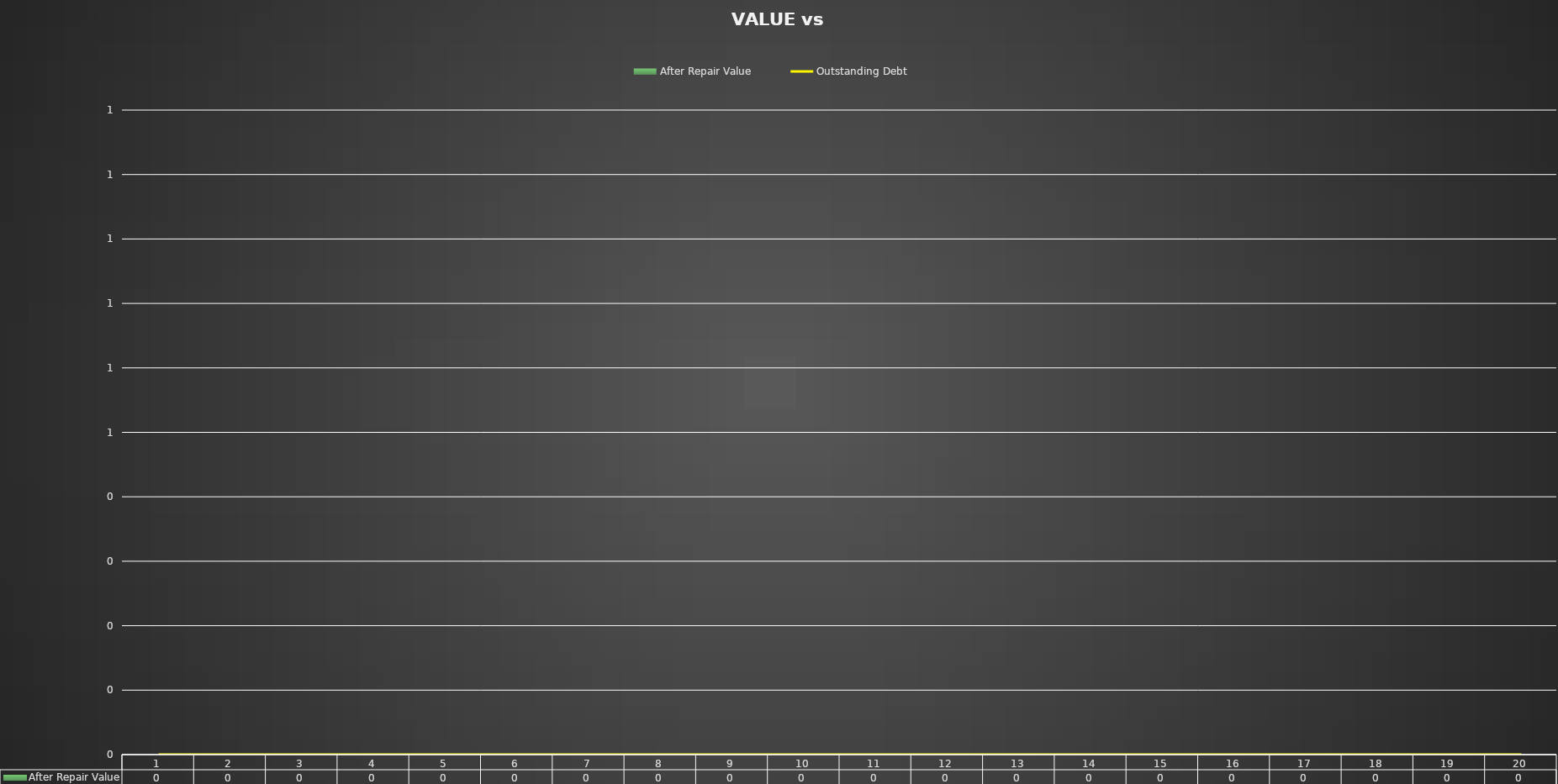
| Category | After Repair Value |
|---|---|
| 0 | 0 |
| 1 | 0 |
| 2 | 0 |
| 3 | 0 |
| 4 | 0 |
| 5 | 0 |
| 6 | 0 |
| 7 | 0 |
| 8 | 0 |
| 9 | 0 |
| 10 | 0 |
| 11 | 0 |
| 12 | 0 |
| 13 | 0 |
| 14 | 0 |
| 15 | 0 |
| 16 | 0 |
| 17 | 0 |
| 18 | 0 |
| 19 | 0 |